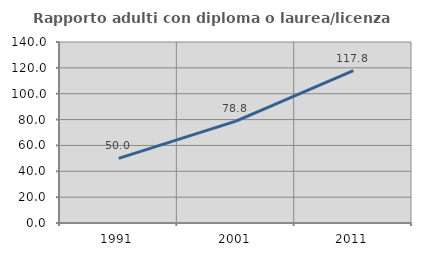
| Category | Rapporto adulti con diploma o laurea/licenza media  |
|---|---|
| 1991.0 | 50 |
| 2001.0 | 78.788 |
| 2011.0 | 117.778 |